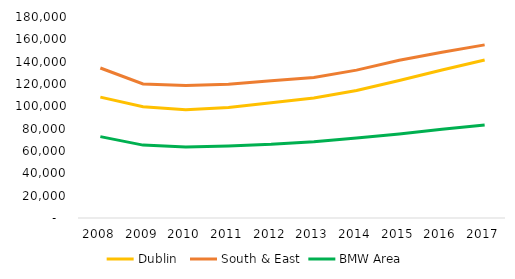
| Category | Dublin  | South & East | BMW Area |
|---|---|---|---|
| 2008.0 | 108237 | 134342 | 72891 |
| 2009.0 | 99550 | 119998 | 65270 |
| 2010.0 | 96867 | 118726 | 63509 |
| 2011.0 | 98895 | 119747 | 64543 |
| 2012.0 | 103115 | 122878 | 65978 |
| 2013.0 | 107408 | 125751 | 68313 |
| 2014.0 | 114191 | 132445 | 71621 |
| 2015.0 | 123080 | 141228 | 75324 |
| 2016.0 | 132538 | 148510 | 79393 |
| 2017.0 | 141511 | 155033 | 83266 |